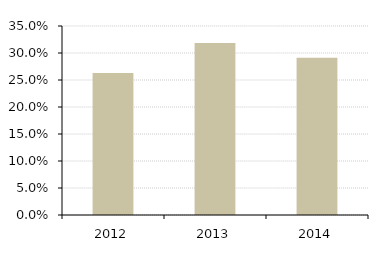
| Category | ROI |
|---|---|
| 2012.0 | 0.263 |
| 2013.0 | 0.318 |
| 2014.0 | 0.291 |